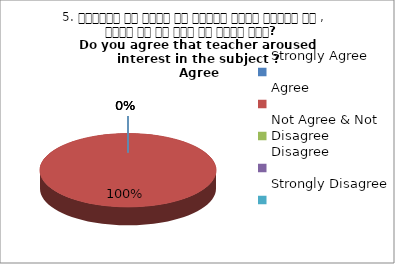
| Category | 5. शिक्षक ने विषय के प्रति रूचि जागृत की , क्या आप इस बात से सहमत हैं?  
Do you agree that teacher aroused interest in the subject ?
 Agree |
|---|---|
| Strongly Agree | 0 |
| Agree | 1 |
| Not Agree & Not Disagree | 0 |
| Disagree | 0 |
| Strongly Disagree | 0 |